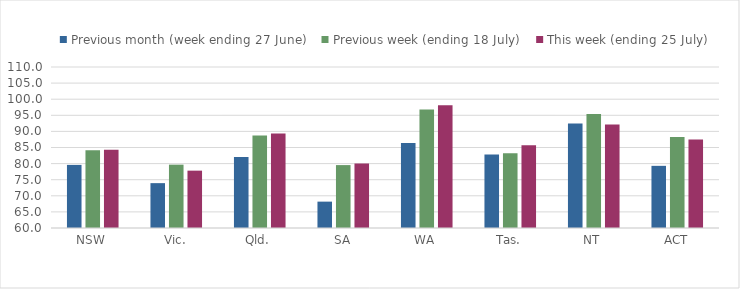
| Category | Previous month (week ending 27 June) | Previous week (ending 18 July) | This week (ending 25 July) |
|---|---|---|---|
| NSW | 79.598 | 84.134 | 84.308 |
| Vic. | 73.932 | 79.674 | 77.809 |
| Qld. | 82.045 | 88.747 | 89.328 |
| SA | 68.189 | 79.538 | 80.026 |
| WA | 86.375 | 96.796 | 98.1 |
| Tas. | 82.788 | 83.183 | 85.71 |
| NT | 92.446 | 95.373 | 92.176 |
| ACT | 79.303 | 88.248 | 87.52 |